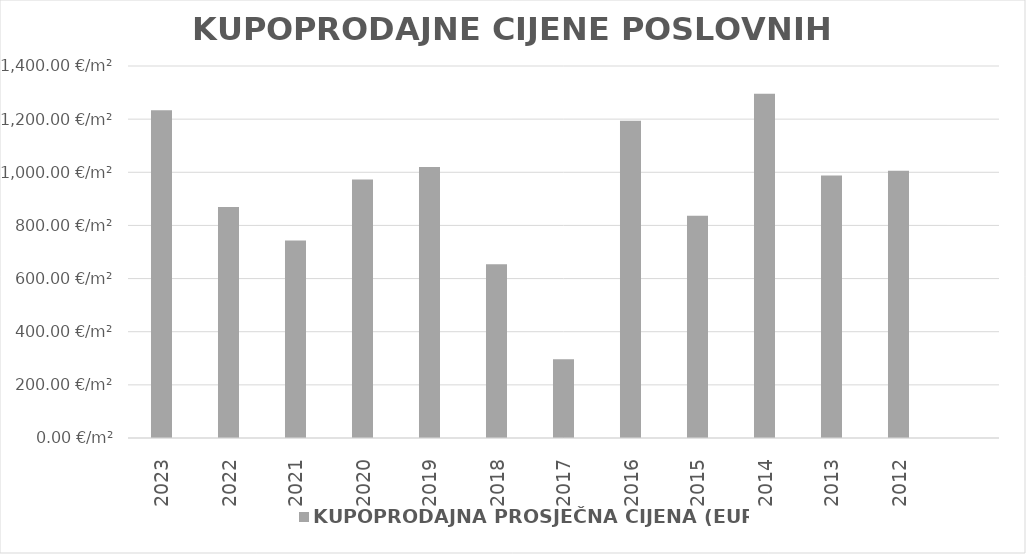
| Category | KUPOPRODAJNA PROSJEČNA CIJENA (EUR/m²) |
|---|---|
| 2023 | 1903-05-17 00:03:14 |
| 2022 | 1902-05-18 18:07:29 |
| 2021 | 1902-01-12 17:24:26 |
| 2020 | 1902-08-29 19:22:43 |
| 2019 | 1902-10-16 04:18:35 |
| 2018 | 1901-10-15 05:52:57 |
| 2017 | 1900-10-22 05:29:20 |
| 2016 | 1903-04-07 23:25:49 |
| 2015 | 1902-04-15 04:53:46 |
| 2014 | 1903-07-18 19:15:38 |
| 2013 | 1902-09-14 04:50:28 |
| 2012 | 1902-10-01 13:30:41 |